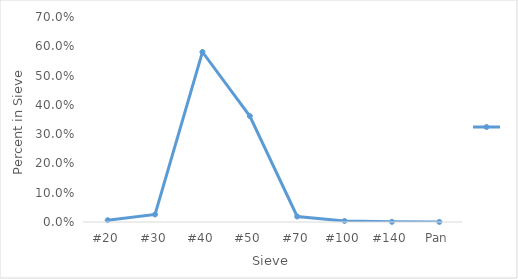
| Category | Series 0 |
|---|---|
| #20 | 0.006 |
| #30 | 0.026 |
| #40 | 0.581 |
| #50 | 0.362 |
| #70 | 0.019 |
| #100 | 0.003 |
| #140 | 0.001 |
| Pan | 0 |